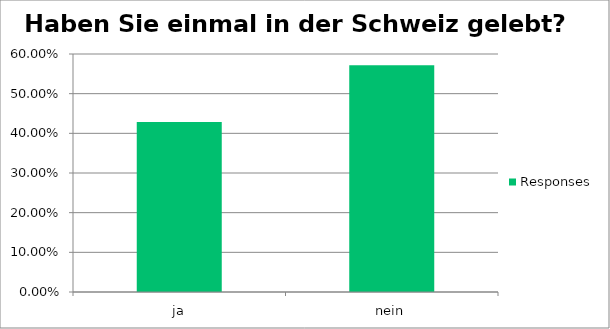
| Category | Responses |
|---|---|
| ja | 0.429 |
| nein | 0.571 |